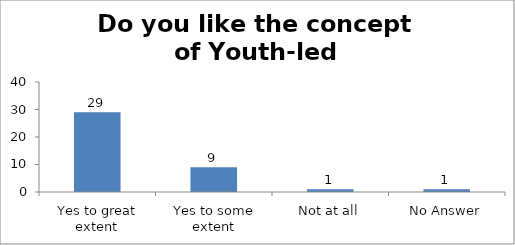
| Category | Do you like the concept of Youth-led Changemaking?  |
|---|---|
| Yes to great extent | 29 |
| Yes to some extent | 9 |
| Not at all | 1 |
| No Answer | 1 |